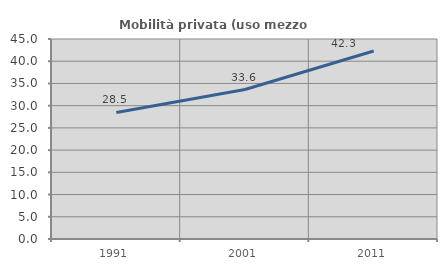
| Category | Mobilità privata (uso mezzo privato) |
|---|---|
| 1991.0 | 28.464 |
| 2001.0 | 33.624 |
| 2011.0 | 42.308 |